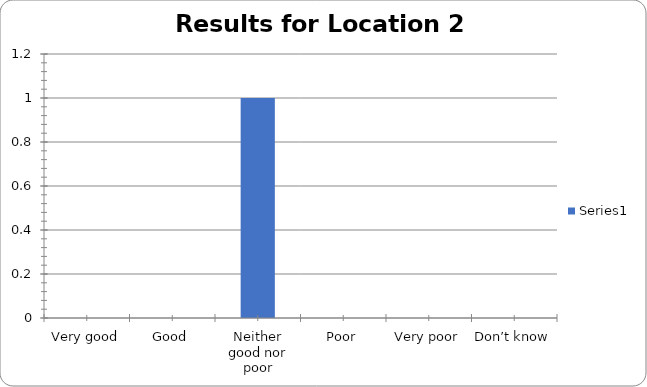
| Category | Series 0 |
|---|---|
| Very good | 0 |
| Good | 0 |
| Neither good nor poor | 1 |
| Poor | 0 |
| Very poor | 0 |
| Don’t know | 0 |